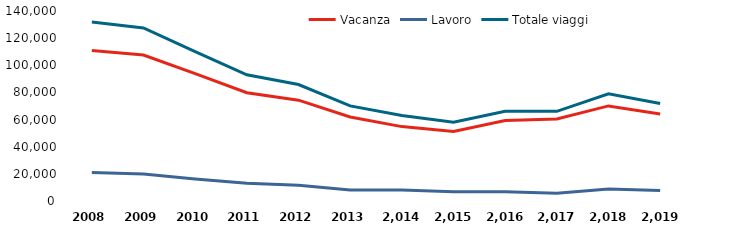
| Category | Vacanza | Lavoro | Totale viaggi |
|---|---|---|---|
| 2008 | 110901 | 21026 | 131928 |
| 2009 | 107603 | 19931 | 127533 |
| 2010 | 93894 | 16179 | 110073 |
| 2011 | 79811 | 13160 | 92971 |
| 2012 | 74301 | 11524 | 85825 |
| 2013 | 61916 | 8167 | 70083 |
| 2014 | 54816 | 8112 | 62927 |
| 2015 | 51222 | 6894 | 58115 |
| 2016 | 59298 | 6757 | 66055 |
| 2017 | 60455 | 5626 | 66081 |
| 2018 | 70070 | 8870 | 78940 |
| 2019 | 64117 | 7766 | 71883 |